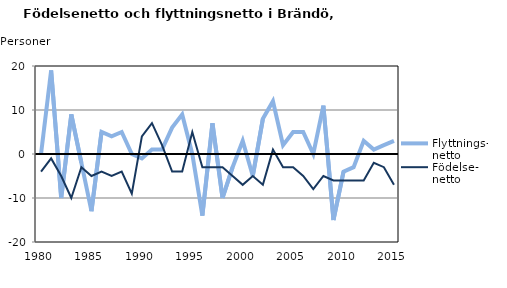
| Category | Flyttnings- netto | Födelse- netto |
|---|---|---|
| 1980.0 | 0 | -4 |
| 1981.0 | 19 | -1 |
| 1982.0 | -10 | -5 |
| 1983.0 | 9 | -10 |
| 1984.0 | -2 | -3 |
| 1985.0 | -13 | -5 |
| 1986.0 | 5 | -4 |
| 1987.0 | 4 | -5 |
| 1988.0 | 5 | -4 |
| 1989.0 | 0 | -9 |
| 1990.0 | -1 | 4 |
| 1991.0 | 1 | 7 |
| 1992.0 | 1 | 2 |
| 1993.0 | 6 | -4 |
| 1994.0 | 9 | -4 |
| 1995.0 | 0 | 5 |
| 1996.0 | -14 | -3 |
| 1997.0 | 7 | -3 |
| 1998.0 | -10 | -3 |
| 1999.0 | -3 | -5 |
| 2000.0 | 3 | -7 |
| 2001.0 | -5 | -5 |
| 2002.0 | 8 | -7 |
| 2003.0 | 12 | 1 |
| 2004.0 | 2 | -3 |
| 2005.0 | 5 | -3 |
| 2006.0 | 5 | -5 |
| 2007.0 | 0 | -8 |
| 2008.0 | 11 | -5 |
| 2009.0 | -15 | -6 |
| 2010.0 | -4 | -6 |
| 2011.0 | -3 | -6 |
| 2012.0 | 3 | -6 |
| 2013.0 | 1 | -2 |
| 2014.0 | 2 | -3 |
| 2015.0 | 3 | -7 |